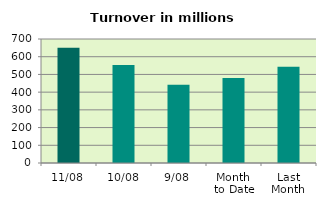
| Category | Series 0 |
|---|---|
| 11/08 | 650.684 |
| 10/08 | 552.599 |
| 9/08 | 441.871 |
| Month 
to Date | 479.475 |
| Last
Month | 542.77 |